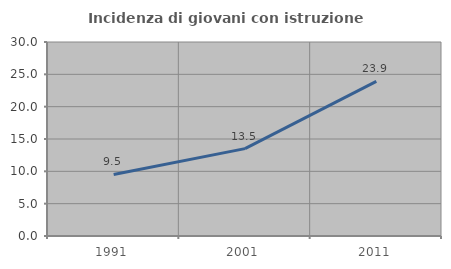
| Category | Incidenza di giovani con istruzione universitaria |
|---|---|
| 1991.0 | 9.521 |
| 2001.0 | 13.508 |
| 2011.0 | 23.905 |